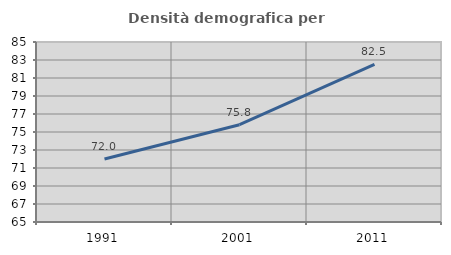
| Category | Densità demografica |
|---|---|
| 1991.0 | 71.999 |
| 2001.0 | 75.81 |
| 2011.0 | 82.508 |